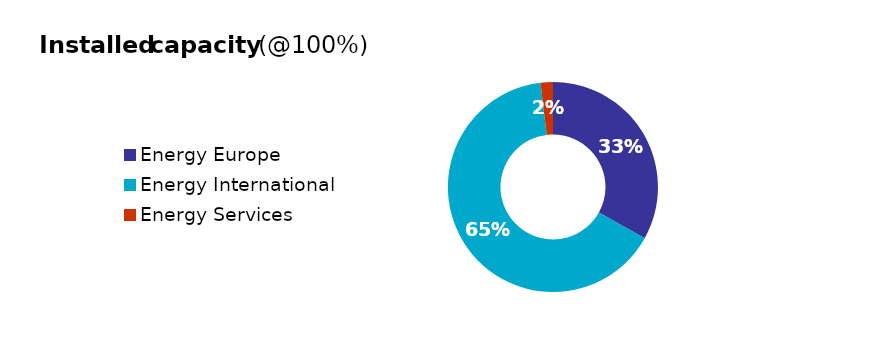
| Category | Total |
|---|---|
| Energy Europe | 39131.371 |
| Energy International | 76841.904 |
| Energy Services | 2255.231 |